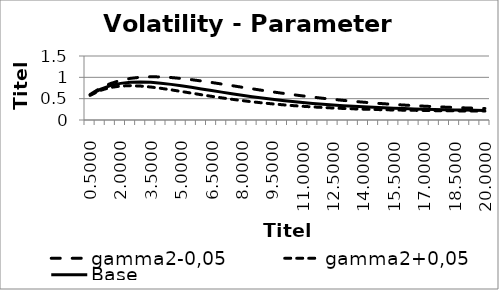
| Category | gamma2-0,05 | gamma2+0,05 | Base |
|---|---|---|---|
| 0.5 | 0.597 | 0.578 | 0.587 |
| 1.0 | 0.745 | 0.693 | 0.719 |
| 1.5 | 0.853 | 0.762 | 0.806 |
| 2.0 | 0.928 | 0.796 | 0.859 |
| 2.5 | 0.976 | 0.804 | 0.885 |
| 3.0 | 1.003 | 0.795 | 0.891 |
| 3.5 | 1.013 | 0.773 | 0.882 |
| 4.0 | 1.009 | 0.743 | 0.863 |
| 4.5 | 0.995 | 0.707 | 0.835 |
| 5.0 | 0.974 | 0.669 | 0.802 |
| 5.5 | 0.946 | 0.63 | 0.767 |
| 6.0 | 0.914 | 0.592 | 0.729 |
| 6.5 | 0.879 | 0.555 | 0.691 |
| 7.0 | 0.843 | 0.519 | 0.653 |
| 7.5 | 0.806 | 0.486 | 0.616 |
| 8.0 | 0.768 | 0.455 | 0.581 |
| 8.5 | 0.731 | 0.427 | 0.547 |
| 9.0 | 0.695 | 0.401 | 0.516 |
| 9.5 | 0.66 | 0.378 | 0.486 |
| 10.0 | 0.627 | 0.357 | 0.459 |
| 10.5 | 0.595 | 0.338 | 0.434 |
| 11.0 | 0.564 | 0.321 | 0.41 |
| 11.5 | 0.536 | 0.306 | 0.389 |
| 12.0 | 0.509 | 0.293 | 0.369 |
| 12.5 | 0.483 | 0.281 | 0.352 |
| 13.0 | 0.46 | 0.271 | 0.336 |
| 13.5 | 0.438 | 0.262 | 0.321 |
| 14.0 | 0.417 | 0.254 | 0.308 |
| 14.5 | 0.399 | 0.247 | 0.296 |
| 15.0 | 0.381 | 0.24 | 0.286 |
| 15.5 | 0.365 | 0.235 | 0.276 |
| 16.0 | 0.35 | 0.23 | 0.267 |
| 16.5 | 0.337 | 0.226 | 0.26 |
| 17.0 | 0.324 | 0.223 | 0.253 |
| 17.5 | 0.313 | 0.22 | 0.247 |
| 18.0 | 0.302 | 0.217 | 0.242 |
| 18.5 | 0.293 | 0.215 | 0.237 |
| 19.0 | 0.284 | 0.213 | 0.232 |
| 19.5 | 0.276 | 0.211 | 0.229 |
| 20.0 | 0.269 | 0.209 | 0.225 |